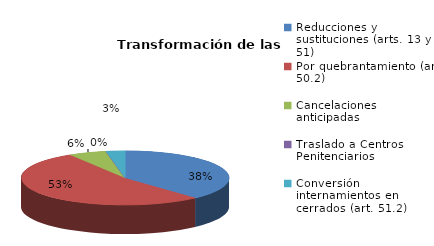
| Category | Series 0 |
|---|---|
| Reducciones y sustituciones (arts. 13 y 51) | 13 |
| Por quebrantamiento (art. 50.2) | 18 |
| Cancelaciones anticipadas | 2 |
| Traslado a Centros Penitenciarios | 0 |
| Conversión internamientos en cerrados (art. 51.2) | 1 |